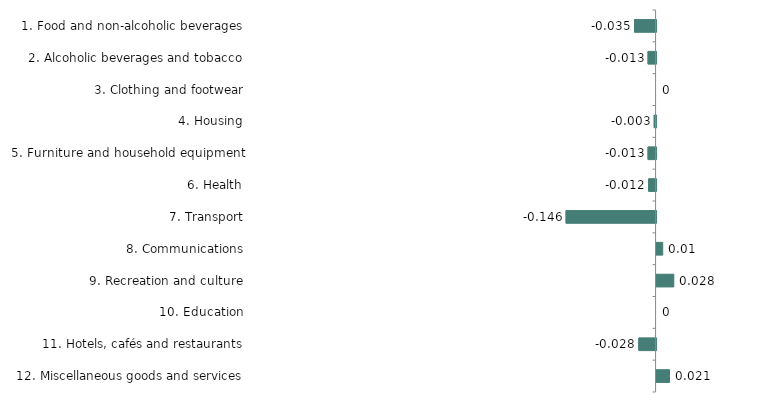
| Category | Series 0 |
|---|---|
| 1. Food and non-alcoholic beverages | -0.035 |
| 2. Alcoholic beverages and tobacco | -0.013 |
| 3. Clothing and footwear | 0 |
| 4. Housing | -0.003 |
| 5. Furniture and household equipment | -0.013 |
| 6. Health | -0.012 |
| 7. Transport | -0.146 |
| 8. Communications | 0.01 |
| 9. Recreation and culture | 0.028 |
| 10. Education | 0 |
| 11. Hotels, cafés and restaurants | -0.028 |
| 12. Miscellaneous goods and services | 0.021 |